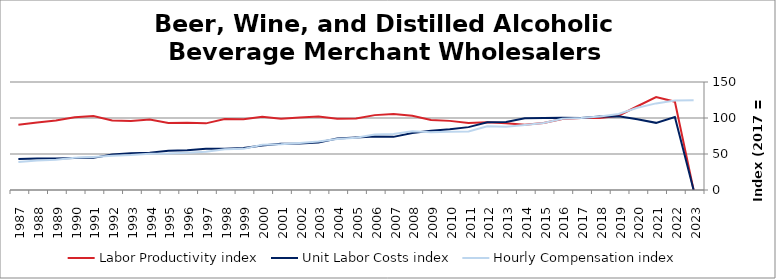
| Category | Labor Productivity index | Unit Labor Costs index | Hourly Compensation index |
|---|---|---|---|
| 2023.0 | 0 | 0 | 124.601 |
| 2022.0 | 122.7 | 101.426 | 124.449 |
| 2021.0 | 128.986 | 93.257 | 120.289 |
| 2020.0 | 116.299 | 98.138 | 114.133 |
| 2019.0 | 103.138 | 102.383 | 105.596 |
| 2018.0 | 100.124 | 101.974 | 102.101 |
| 2017.0 | 100 | 100 | 100 |
| 2016.0 | 98.57 | 100.322 | 98.888 |
| 2015.0 | 93.071 | 100.037 | 93.105 |
| 2014.0 | 90.495 | 99.64 | 90.169 |
| 2013.0 | 92.775 | 94.551 | 87.72 |
| 2012.0 | 93.969 | 94.056 | 88.383 |
| 2011.0 | 93.214 | 87.331 | 81.405 |
| 2010.0 | 96.007 | 84.266 | 80.901 |
| 2009.0 | 97.249 | 82.315 | 80.05 |
| 2008.0 | 103.102 | 79.073 | 81.526 |
| 2007.0 | 105.494 | 73.794 | 77.848 |
| 2006.0 | 103.994 | 74.249 | 77.214 |
| 2005.0 | 99.321 | 72.949 | 72.454 |
| 2004.0 | 99.126 | 71.41 | 70.786 |
| 2003.0 | 102.009 | 66.081 | 67.409 |
| 2002.0 | 100.758 | 64.754 | 65.244 |
| 2001.0 | 99.076 | 64.099 | 63.507 |
| 2000.0 | 101.678 | 61.736 | 62.772 |
| 1999.0 | 98.104 | 58.234 | 57.13 |
| 1998.0 | 98.718 | 57.422 | 56.686 |
| 1997.0 | 92.552 | 57.372 | 53.099 |
| 1996.0 | 93.312 | 55.361 | 51.658 |
| 1995.0 | 93.046 | 54.495 | 50.706 |
| 1994.0 | 97.822 | 51.638 | 50.513 |
| 1993.0 | 95.666 | 50.919 | 48.712 |
| 1992.0 | 96.559 | 49.226 | 47.532 |
| 1991.0 | 102.619 | 44.628 | 45.797 |
| 1990.0 | 100.951 | 44.355 | 44.776 |
| 1989.0 | 96.379 | 43.744 | 42.16 |
| 1988.0 | 93.708 | 43.857 | 41.097 |
| 1987.0 | 90.647 | 43.085 | 39.055 |